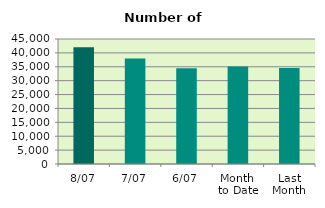
| Category | Series 0 |
|---|---|
| 8/07 | 41986 |
| 7/07 | 37948 |
| 6/07 | 34446 |
| Month 
to Date | 35133 |
| Last
Month | 34545 |